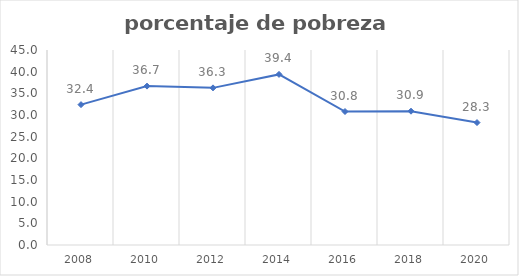
| Category | Series 0 |
|---|---|
| 2008.0 | 32.394 |
| 2010.0 | 36.669 |
| 2012.0 | 36.26 |
| 2014.0 | 39.369 |
| 2016.0 | 30.807 |
| 2018.0 | 30.878 |
| 2020.0 | 28.254 |